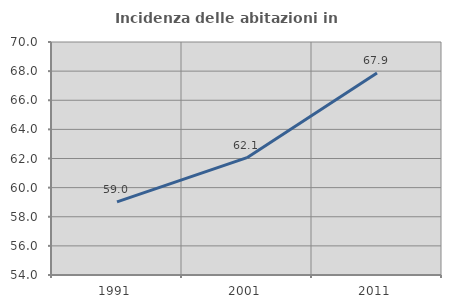
| Category | Incidenza delle abitazioni in proprietà  |
|---|---|
| 1991.0 | 59.016 |
| 2001.0 | 62.055 |
| 2011.0 | 67.87 |